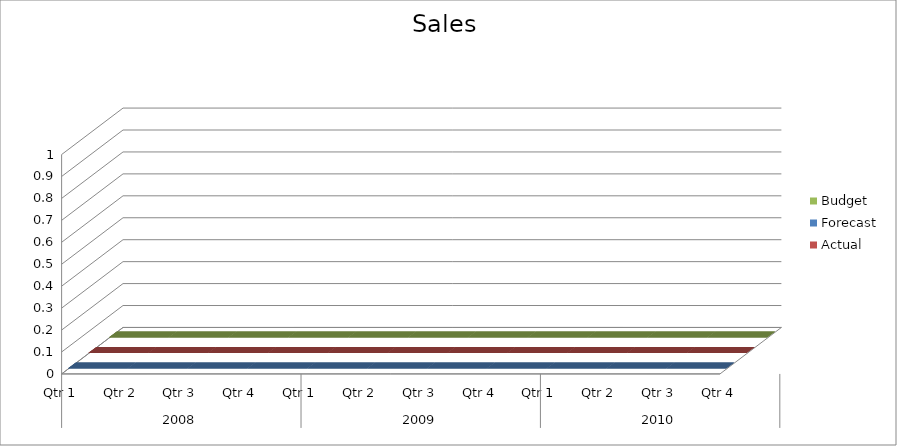
| Category | Budget | Forecast | Actual |
|---|---|---|---|
| 0 | 920 | 3060 | 3250 |
| 1 | 3180 | 1440 | 2340 |
| 2 | 2530 | 2350 | 2380 |
| 3 | 2880 | 1710 | 3030 |
| 4 | 2350 | 1070 | 590 |
| 5 | 920 | 2150 | 880 |
| 6 | 1440 | 550 | 1000 |
| 7 | 2220 | 580 | 1860 |
| 8 | 800 | 3070 | 3180 |
| 9 | 1730 | 3040 | 1540 |
| 10 | 2480 | 1730 | 1700 |
| 11 | 1480 | 3440 | 1600 |